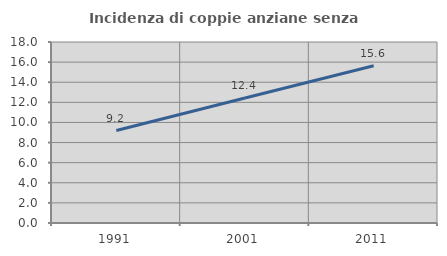
| Category | Incidenza di coppie anziane senza figli  |
|---|---|
| 1991.0 | 9.191 |
| 2001.0 | 12.428 |
| 2011.0 | 15.645 |